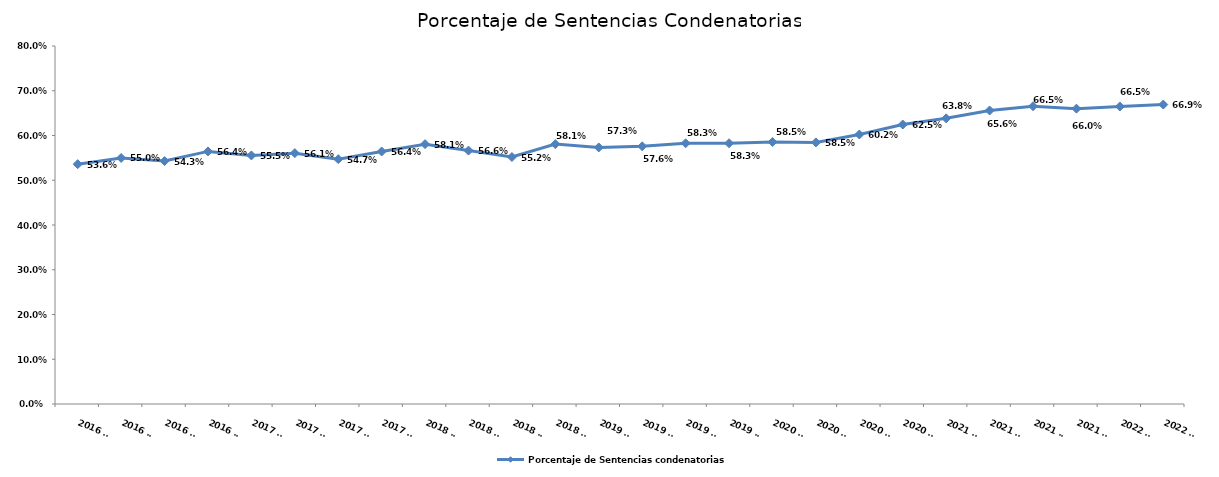
| Category | Porcentaje de Sentencias condenatorias |
|---|---|
| 2016 T1 | 0.536 |
| 2016 T2 | 0.55 |
| 2016 T3 | 0.543 |
| 2016 T4 | 0.564 |
| 2017 T1 | 0.555 |
| 2017 T2 | 0.561 |
| 2017 T3 | 0.547 |
| 2017 T4 | 0.564 |
| 2018 T1 | 0.581 |
| 2018 T2 | 0.566 |
| 2018 T3 | 0.552 |
| 2018 T4 | 0.581 |
| 2019 T1 | 0.573 |
| 2019 T2 | 0.576 |
| 2019 T3 | 0.583 |
| 2019 T4 | 0.583 |
| 2020 T1 | 0.585 |
| 2020 T2 | 0.585 |
| 2020 T3 | 0.602 |
| 2020 T4 | 0.625 |
| 2021 T1 | 0.638 |
| 2021 T2 | 0.656 |
| 2021 T3 | 0.665 |
| 2021 T4 | 0.66 |
| 2022 T1 | 0.665 |
| 2022 T2 | 0.669 |